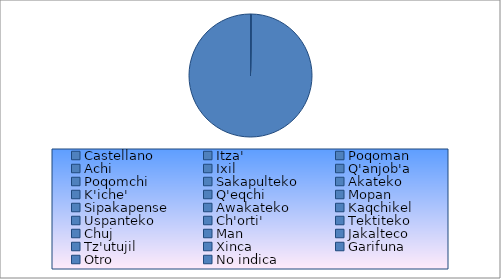
| Category | Series 0 |
|---|---|
| Castellano | 1447 |
| Itza' | 0 |
| Poqoman | 0 |
| Achi | 0 |
| Ixil | 0 |
| Q'anjob'a | 0 |
| Poqomchi | 0 |
| Sakapulteko | 0 |
| Akateko | 0 |
| K'iche' | 0 |
| Q'eqchi | 0 |
| Mopan | 0 |
| Sipakapense | 0 |
| Awakateko | 0 |
| Kaqchikel | 0 |
| Uspanteko | 0 |
| Ch'orti' | 0 |
| Tektiteko | 0 |
| Chuj | 0 |
| Man | 0 |
| Jakalteco | 0 |
| Tz'utujil | 0 |
| Xinca | 0 |
| Garifuna | 0 |
| Otro | 0 |
| No indica | 0 |